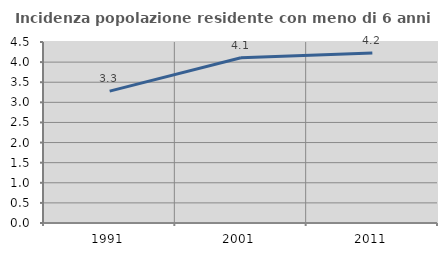
| Category | Incidenza popolazione residente con meno di 6 anni |
|---|---|
| 1991.0 | 3.279 |
| 2001.0 | 4.11 |
| 2011.0 | 4.225 |